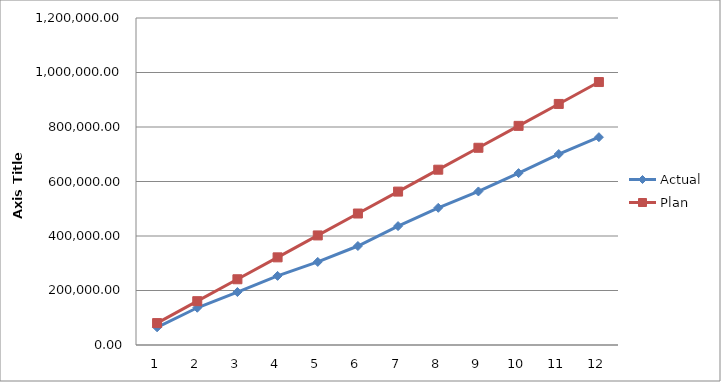
| Category | Actual | Plan |
|---|---|---|
| 0 | 64942.64 | 80416.667 |
| 1 | 136684.59 | 160833.333 |
| 2 | 194286.54 | 241250 |
| 3 | 253646.45 | 321666.667 |
| 4 | 304836.03 | 402083.333 |
| 5 | 363234.95 | 482500 |
| 6 | 436298.57 | 562916.667 |
| 7 | 503389.67 | 643333.333 |
| 8 | 563505.02 | 723750 |
| 9 | 630768.65 | 804166.667 |
| 10 | 700813.35 | 884583.333 |
| 11 | 762624.18 | 965000 |